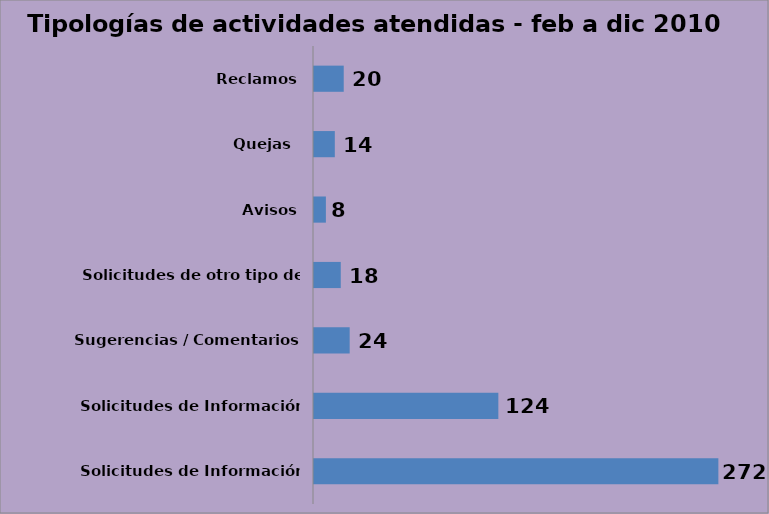
| Category | Series 0 |
|---|---|
| Solicitudes de Información Oficiosa | 272 |
| Solicitudes de Información Especifica | 124 |
| Sugerencias / Comentarios | 24 |
| Solicitudes de otro tipo de Información | 18 |
| Avisos | 8 |
| Quejas  | 14 |
| Reclamos | 20 |